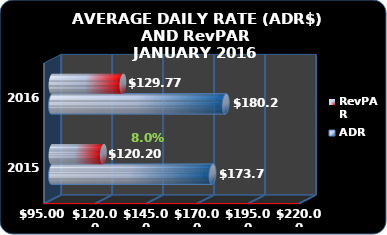
| Category | ADR | RevPAR |
|---|---|---|
| 2016.0 | 180.238 | 129.77 |
| 2015.0 | 173.731 | 120.203 |